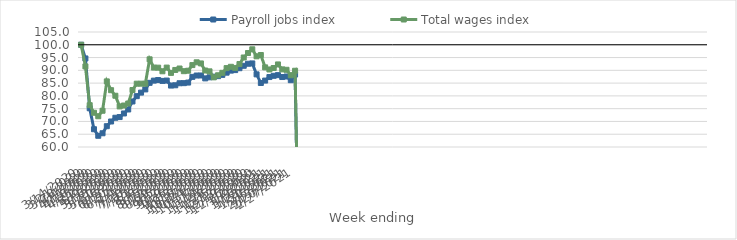
| Category | Payroll jobs index | Total wages index |
|---|---|---|
| 14/03/2020 | 100 | 100 |
| 21/03/2020 | 94.653 | 91.533 |
| 28/03/2020 | 75.152 | 76.37 |
| 04/04/2020 | 66.953 | 73.4 |
| 11/04/2020 | 64.391 | 72.027 |
| 18/04/2020 | 65.371 | 74.19 |
| 25/04/2020 | 68.144 | 85.673 |
| 02/05/2020 | 69.978 | 82.23 |
| 09/05/2020 | 71.444 | 80.058 |
| 16/05/2020 | 71.72 | 75.879 |
| 23/05/2020 | 73.121 | 76.239 |
| 30/05/2020 | 74.682 | 77.022 |
| 06/06/2020 | 77.818 | 82.296 |
| 13/06/2020 | 79.89 | 84.775 |
| 20/06/2020 | 81.28 | 84.777 |
| 27/06/2020 | 82.531 | 84.776 |
| 04/07/2020 | 85.105 | 94.315 |
| 11/07/2020 | 85.978 | 91.08 |
| 18/07/2020 | 86.204 | 91.044 |
| 25/07/2020 | 85.869 | 89.631 |
| 01/08/2020 | 86.003 | 91.076 |
| 08/08/2020 | 84.039 | 88.994 |
| 15/08/2020 | 84.154 | 90.147 |
| 22/08/2020 | 84.95 | 90.717 |
| 29/08/2020 | 84.985 | 89.668 |
| 05/09/2020 | 85.211 | 89.851 |
| 12/09/2020 | 87.44 | 92.05 |
| 19/09/2020 | 87.971 | 93.142 |
| 26/09/2020 | 87.984 | 92.7 |
| 03/10/2020 | 86.853 | 89.925 |
| 10/10/2020 | 87.275 | 89.602 |
| 17/10/2020 | 87.523 | 87.258 |
| 24/10/2020 | 87.718 | 88.068 |
| 31/10/2020 | 88.224 | 89.022 |
| 07/11/2020 | 89.086 | 90.874 |
| 14/11/2020 | 89.889 | 91.385 |
| 21/11/2020 | 90.092 | 90.936 |
| 28/11/2020 | 90.833 | 92.464 |
| 05/12/2020 | 91.778 | 95.022 |
| 12/12/2020 | 92.577 | 96.772 |
| 19/12/2020 | 92.7 | 98.223 |
| 26/12/2020 | 88.424 | 95.486 |
| 02/01/2021 | 85.051 | 95.998 |
| 09/01/2021 | 85.992 | 91.158 |
| 16/01/2021 | 87.368 | 90.342 |
| 23/01/2021 | 87.86 | 90.91 |
| 30/01/2021 | 88.119 | 92.31 |
| 06/02/2021 | 87.38 | 90.372 |
| 13/02/2021 | 87.589 | 90.215 |
| 20/02/2021 | 86.143 | 88.072 |
| 27/02/2021 | 88.35 | 89.832 |